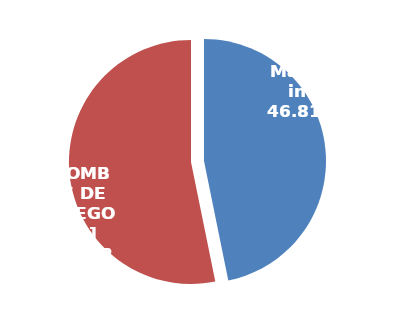
| Category | Series 0 |
|---|---|
| Masculino | 0.468 |
| Femenino | 0.532 |